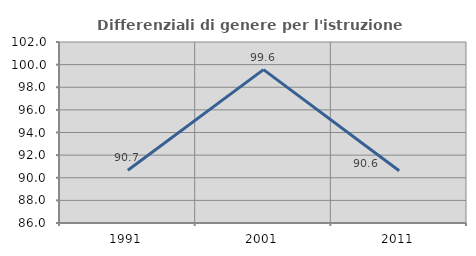
| Category | Differenziali di genere per l'istruzione superiore |
|---|---|
| 1991.0 | 90.662 |
| 2001.0 | 99.56 |
| 2011.0 | 90.62 |